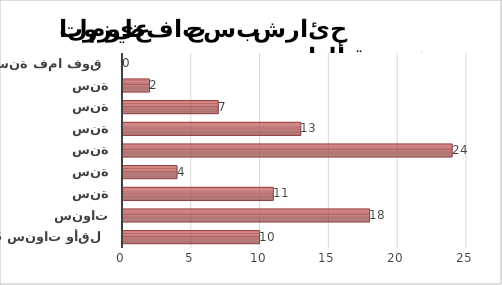
| Category | Series 1 |
|---|---|
| 5 سنوات وأقل | 10 |
| ما بين 6 و10 سنوات | 18 |
| ما بين 11 و 15 سنة | 11 |
| ما بين 16 و20 سنة | 4 |
| ما بين 21 و25 سنة | 24 |
| ما بين 26 و30 سنة | 13 |
| ما بين 31 و35 سنة | 7 |
| ما بين 36 و40 سنة | 2 |
| 41 سنة فما فوق | 0 |